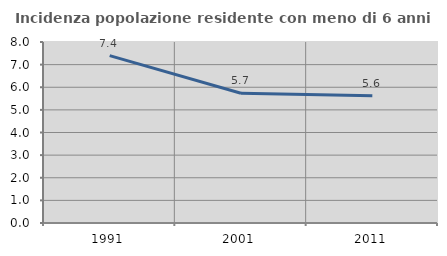
| Category | Incidenza popolazione residente con meno di 6 anni |
|---|---|
| 1991.0 | 7.399 |
| 2001.0 | 5.737 |
| 2011.0 | 5.629 |